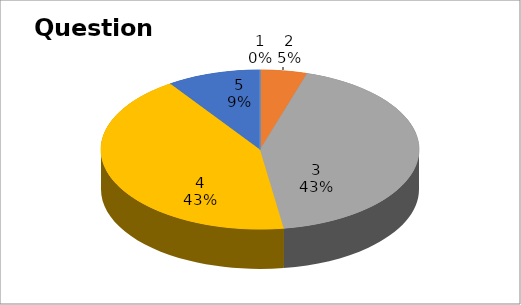
| Category | Series 0 |
|---|---|
| 0 | 0 |
| 1 | 1 |
| 2 | 9 |
| 3 | 9 |
| 4 | 2 |